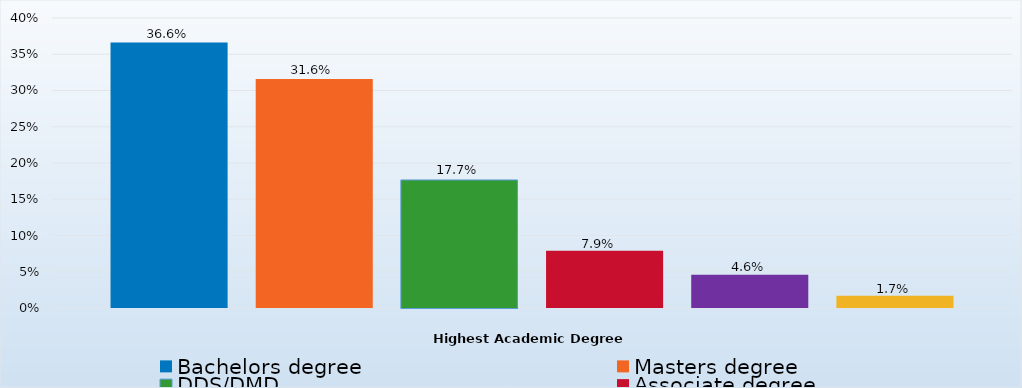
| Category | Bachelors degree | Masters degree | DDS/DMD | Associate degree | Doctorate degree | Certificate/Diploma/Other |
|---|---|---|---|---|---|---|
| Percent | 0.366 | 0.316 | 0.177 | 0.079 | 0.046 | 0.017 |